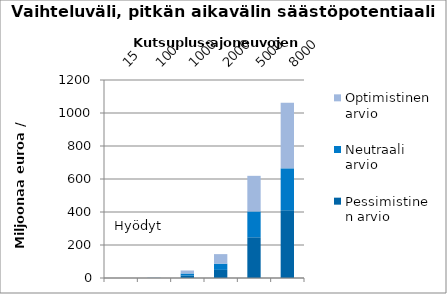
| Category | Pessimistinen arvio | Neutraali arvio | Optimistinen arvio |
|---|---|---|---|
| 15.0 | 0.091 | 0.02 | 0.027 |
| 100.0 | 0.607 | 0.301 | 0.415 |
| 1000.0 | 14.745 | 12.534 | 18.296 |
| 2000.0 | 49.113 | 37.833 | 57.804 |
| 5000.0 | 246.769 | 156.627 | 215.768 |
| 8000.0 | 410.288 | 254.305 | 397.764 |